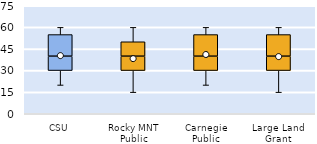
| Category | 25th | 50th | 75th |
|---|---|---|---|
| CSU | 30 | 10 | 15 |
| Rocky MNT Public | 30 | 10 | 10 |
| Carnegie Public | 30 | 10 | 15 |
| Large Land Grant | 30 | 10 | 15 |